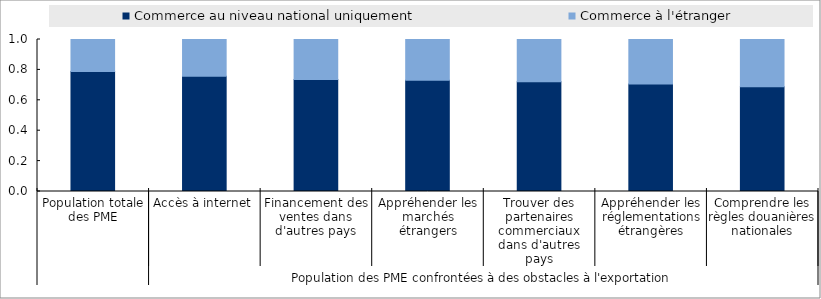
| Category | Commerce au niveau national uniquement | Commerce à l'étranger |
|---|---|---|
| 0 | 79 | 21 |
| 1 | 75.77 | 24.23 |
| 2 | 73.643 | 26.357 |
| 3 | 73.122 | 26.878 |
| 4 | 72.149 | 27.851 |
| 5 | 70.763 | 29.237 |
| 6 | 68.896 | 31.104 |